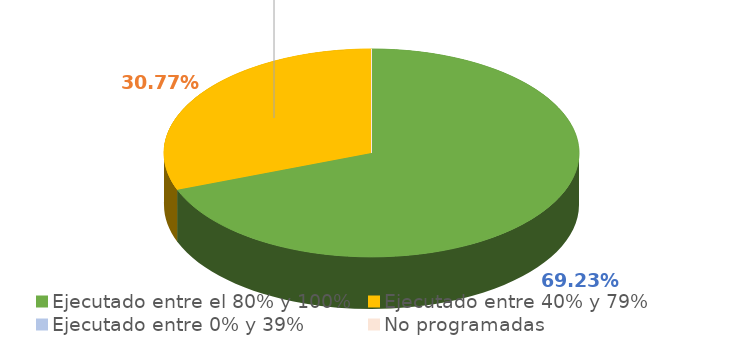
| Category | Series 0 |
|---|---|
| Ejecutado entre el 80% y 100% | 0.692 |
| Ejecutado entre 40% y 79% | 0.308 |
| Ejecutado entre 0% y 39% | 0 |
| No programadas | 0 |